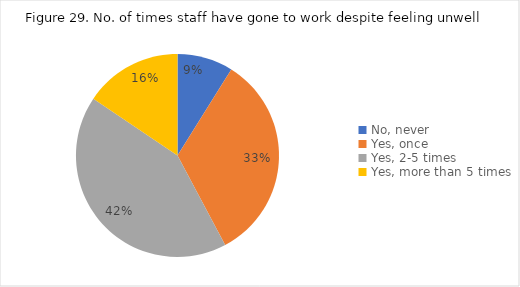
| Category | Series 0 |
|---|---|
| No, never | 0.089 |
| Yes, once | 0.333 |
| Yes, 2-5 times | 0.422 |
| Yes, more than 5 times | 0.156 |